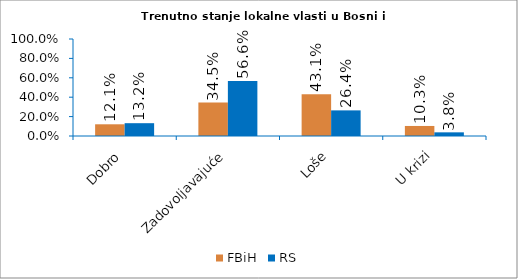
| Category | FBiH | RS |
|---|---|---|
| Dobro | 0.121 | 0.132 |
| Zadovoljavajuće | 0.345 | 0.566 |
| Loše | 0.431 | 0.264 |
| U krizi | 0.103 | 0.038 |